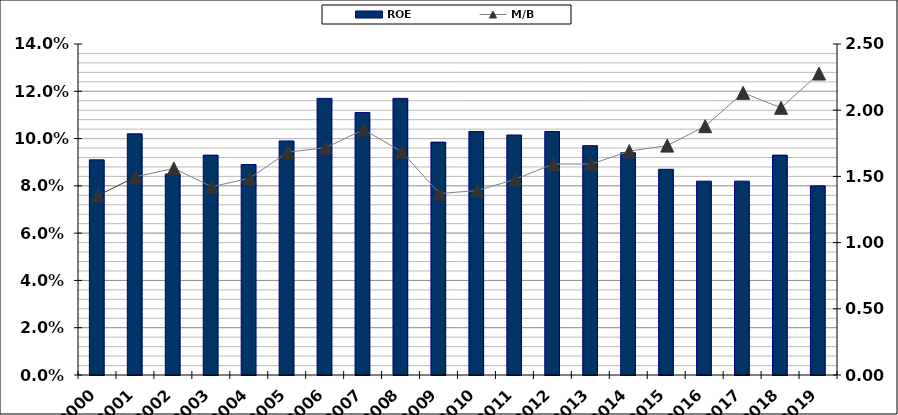
| Category | ROE |
|---|---|
| 2000.0 | 0.091 |
| 2001.0 | 0.102 |
| 2002.0 | 0.085 |
| 2003.0 | 0.093 |
| 2004.0 | 0.089 |
| 2005.0 | 0.099 |
| 2006.0 | 0.117 |
| 2007.0 | 0.111 |
| 2008.0 | 0.117 |
| 2009.0 | 0.098 |
| 2010.0 | 0.103 |
| 2011.0 | 0.102 |
| 2012.0 | 0.103 |
| 2013.0 | 0.097 |
| 2014.0 | 0.094 |
| 2015.0 | 0.087 |
| 2016.0 | 0.082 |
| 2017.0 | 0.082 |
| 2018.0 | 0.093 |
| 2019.0 | 0.08 |